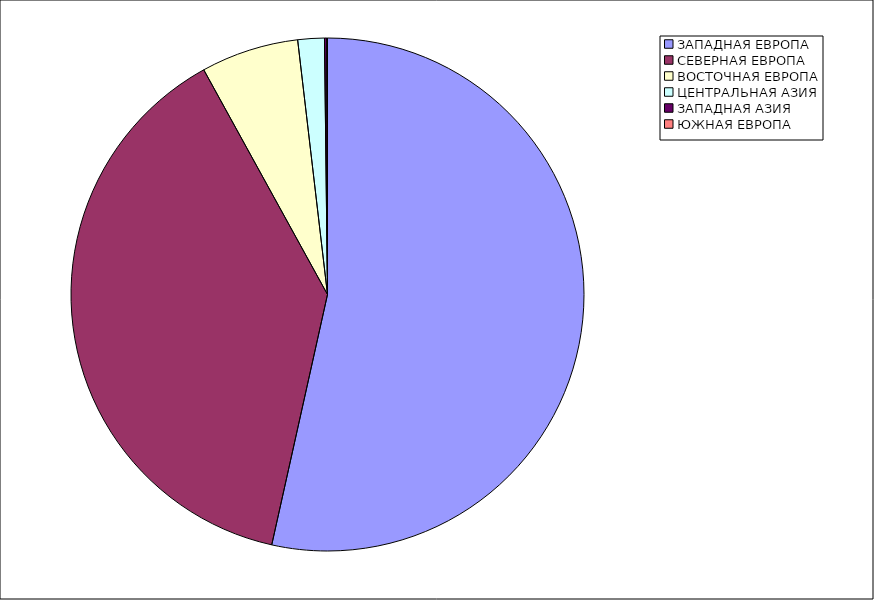
| Category | Оборот |
|---|---|
| ЗАПАДНАЯ ЕВРОПА | 53.488 |
| СЕВЕРНАЯ ЕВРОПА | 38.499 |
| ВОСТОЧНАЯ ЕВРОПА | 6.154 |
| ЦЕНТРАЛЬНАЯ АЗИЯ | 1.671 |
| ЗАПАДНАЯ АЗИЯ | 0.139 |
| ЮЖНАЯ ЕВРОПА | 0.048 |